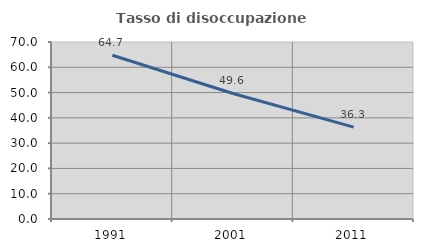
| Category | Tasso di disoccupazione giovanile  |
|---|---|
| 1991.0 | 64.748 |
| 2001.0 | 49.647 |
| 2011.0 | 36.332 |